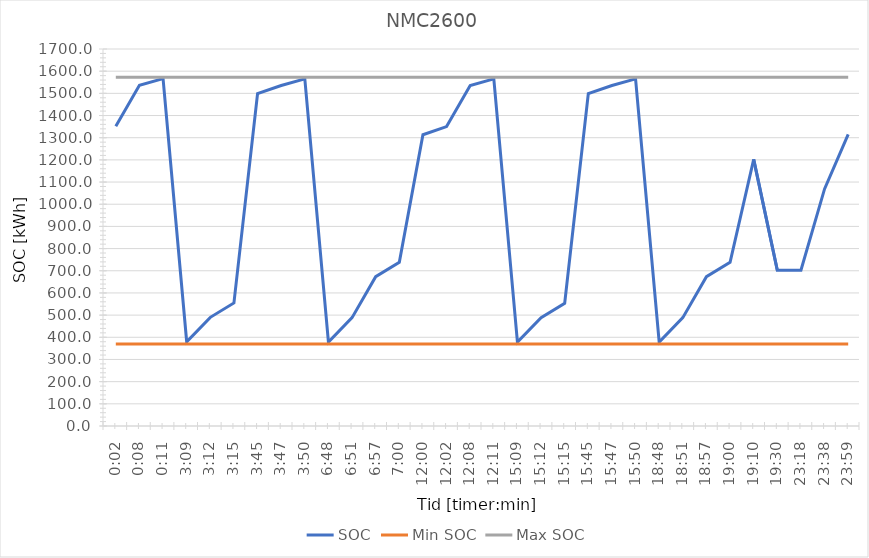
| Category | SOC | Min SOC | Max SOC |
|---|---|---|---|
| 0.001388888888888889 | 1351.667 | 370 | 1572.5 |
| 0.005555555555555556 | 1536.667 | 370 | 1572.5 |
| 0.007638888888888889 | 1566.667 | 370 | 1572.5 |
| 0.13125 | 380 | 370 | 1572.5 |
| 0.13333333333333333 | 490 | 370 | 1572.5 |
| 0.13541666666666666 | 555 | 370 | 1572.5 |
| 0.15625 | 1498.5 | 370 | 1572.5 |
| 0.15763888888888888 | 1535.167 | 370 | 1572.5 |
| 0.15972222222222224 | 1565.167 | 370 | 1572.5 |
| 0.2833333333333333 | 378.5 | 370 | 1572.5 |
| 0.28541666666666665 | 488.5 | 370 | 1572.5 |
| 0.28958333333333336 | 673.5 | 370 | 1572.5 |
| 0.2916666666666667 | 738.5 | 370 | 1572.5 |
| 0.5 | 1313.5 | 370 | 1572.5 |
| 0.5013888888888889 | 1350.167 | 370 | 1572.5 |
| 0.5055555555555555 | 1535.167 | 370 | 1572.5 |
| 0.5076388888888889 | 1565.167 | 370 | 1572.5 |
| 0.63125 | 378.5 | 370 | 1572.5 |
| 0.6333333333333333 | 488.5 | 370 | 1572.5 |
| 0.6354166666666666 | 553.5 | 370 | 1572.5 |
| 0.65625 | 1498.5 | 370 | 1572.5 |
| 0.6576388888888889 | 1535.167 | 370 | 1572.5 |
| 0.6597222222222222 | 1565.167 | 370 | 1572.5 |
| 0.7833333333333333 | 378.5 | 370 | 1572.5 |
| 0.7854166666666668 | 488.5 | 370 | 1572.5 |
| 0.7895833333333333 | 673.5 | 370 | 1572.5 |
| 0.7916666666666666 | 738.5 | 370 | 1572.5 |
| 0.7986111111111112 | 1202.5 | 370 | 1572.5 |
| 0.8125 | 702.5 | 370 | 1572.5 |
| 0.9708333333333333 | 702.5 | 370 | 1572.5 |
| 0.9847222222222222 | 1069.167 | 370 | 1572.5 |
| 0.9993055555555556 | 1315 | 370 | 1572.5 |